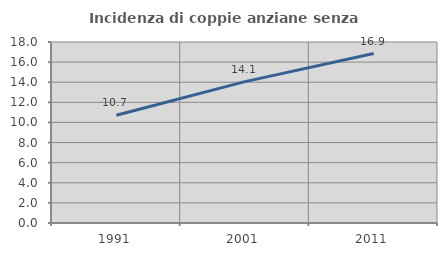
| Category | Incidenza di coppie anziane senza figli  |
|---|---|
| 1991.0 | 10.723 |
| 2001.0 | 14.057 |
| 2011.0 | 16.853 |